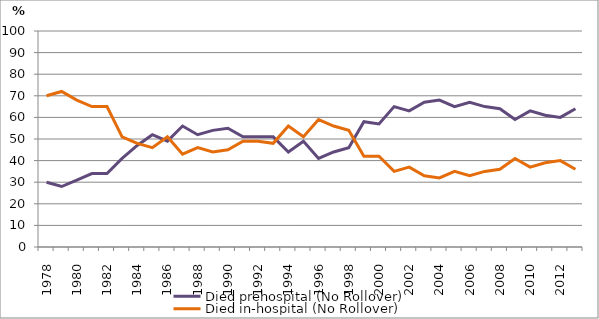
| Category | Died prehospital (No Rollover) | Died in-hospital (No Rollover) |
|---|---|---|
| 1978.0 | 30 | 70 |
| 1979.0 | 28 | 72 |
| 1980.0 | 31 | 68 |
| 1981.0 | 34 | 65 |
| 1982.0 | 34 | 65 |
| 1983.0 | 41 | 51 |
| 1984.0 | 47 | 48 |
| 1985.0 | 52 | 46 |
| 1986.0 | 49 | 51 |
| 1987.0 | 56 | 43 |
| 1988.0 | 52 | 46 |
| 1989.0 | 54 | 44 |
| 1990.0 | 55 | 45 |
| 1991.0 | 51 | 49 |
| 1992.0 | 51 | 49 |
| 1993.0 | 51 | 48 |
| 1994.0 | 44 | 56 |
| 1995.0 | 49 | 51 |
| 1996.0 | 41 | 59 |
| 1997.0 | 44 | 56 |
| 1998.0 | 46 | 54 |
| 1999.0 | 58 | 42 |
| 2000.0 | 57 | 42 |
| 2001.0 | 65 | 35 |
| 2002.0 | 63 | 37 |
| 2003.0 | 67 | 33 |
| 2004.0 | 68 | 32 |
| 2005.0 | 65 | 35 |
| 2006.0 | 67 | 33 |
| 2007.0 | 65 | 35 |
| 2008.0 | 64 | 36 |
| 2009.0 | 59 | 41 |
| 2010.0 | 63 | 37 |
| 2011.0 | 61 | 39 |
| 2012.0 | 60 | 40 |
| 2013.0 | 64 | 36 |